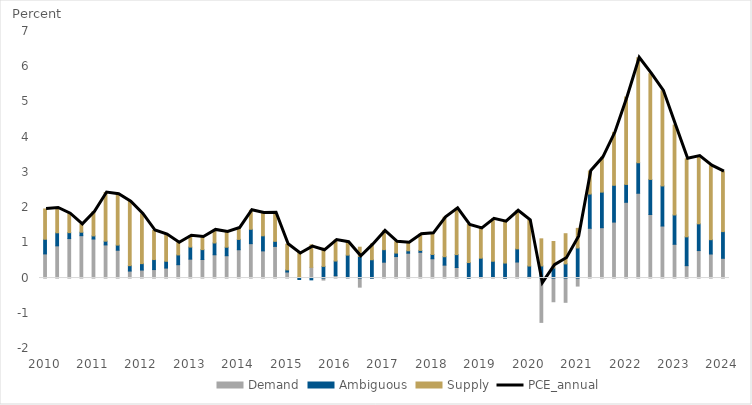
| Category | Demand | Ambiguous | Supply |
|---|---|---|---|
| 2010 | 0.686 | 0.416 | 0.86 |
| 2010 Q2 | 0.915 | 0.37 | 0.704 |
| 2010 Q3 | 1.121 | 0.168 | 0.538 |
| 2010 Q4 | 1.204 | 0.098 | 0.223 |
| 2011 | 1.108 | 0.088 | 0.685 |
| 2011 Q2 | 0.941 | 0.106 | 1.382 |
| 2011 Q3 | 0.79 | 0.145 | 1.446 |
| 2011 Q4 | 0.199 | 0.153 | 1.819 |
| 2012 | 0.228 | 0.182 | 1.413 |
| 2012 Q2 | 0.241 | 0.284 | 0.825 |
| 2012 Q3 | 0.284 | 0.193 | 0.758 |
| 2012 Q4 | 0.379 | 0.278 | 0.346 |
| 2013 | 0.536 | 0.343 | 0.323 |
| 2013 Q2 | 0.527 | 0.28 | 0.357 |
| 2013 Q3 | 0.661 | 0.335 | 0.37 |
| 2013 Q4 | 0.634 | 0.242 | 0.431 |
| 2014 | 0.804 | 0.293 | 0.327 |
| 2014 Q2 | 0.977 | 0.408 | 0.541 |
| 2014 Q3 | 0.772 | 0.427 | 0.651 |
| 2014 Q4 | 0.899 | 0.144 | 0.813 |
| 2015 | 0.172 | 0.059 | 0.729 |
| 2015 Q2 | 0.032 | -0.041 | 0.706 |
| 2015 Q3 | 0.304 | -0.051 | 0.638 |
| 2015 Q4 | -0.057 | 0.331 | 0.514 |
| 2016 | 0.069 | 0.415 | 0.597 |
| 2016 Q2 | 0.012 | 0.639 | 0.368 |
| 2016 Q3 | -0.258 | 0.615 | 0.261 |
| 2016 Q4 | -0.012 | 0.519 | 0.448 |
| 2017 | 0.451 | 0.355 | 0.533 |
| 2017 Q2 | 0.611 | 0.099 | 0.321 |
| 2017 Q3 | 0.706 | 0.069 | 0.229 |
| 2017 Q4 | 0.732 | 0.053 | 0.461 |
| 2018 | 0.548 | 0.122 | 0.599 |
| 2018 Q2 | 0.367 | 0.239 | 1.121 |
| 2018 Q3 | 0.3 | 0.366 | 1.314 |
| 2018 Q4 | -0.01 | 0.44 | 1.081 |
| 2019 | 0.019 | 0.546 | 0.846 |
| 2019 Q2 | 0.045 | 0.432 | 1.204 |
| 2019 Q3 | -0.008 | 0.426 | 1.183 |
| 2019 Q4 | 0.455 | 0.373 | 1.082 |
| 2020 | 0.047 | 0.294 | 1.299 |
| 2020 Q2 | -1.259 | 0.344 | 0.77 |
| 2020 Q3 | -0.673 | 0.286 | 0.752 |
| 2020 Q4 | -0.689 | 0.403 | 0.856 |
| 2021 | -0.227 | 0.855 | 0.556 |
| 2021 Q2 | 1.413 | 0.973 | 0.653 |
| 2021 Q3 | 1.43 | 1.01 | 0.987 |
| 2021 Q4 | 1.589 | 1.044 | 1.505 |
| 2022 | 2.151 | 0.507 | 2.484 |
| 2022 Q2 | 2.408 | 0.866 | 2.981 |
| 2022 Q3 | 1.804 | 0.996 | 3.002 |
| 2022 Q4 | 1.477 | 1.139 | 2.699 |
| 2023 | 0.959 | 0.833 | 2.553 |
| 2023 Q2 | 0.352 | 0.818 | 2.216 |
| 2023 Q3 | 0.78 | 0.759 | 1.923 |
| 2023 Q4 | 0.683 | 0.406 | 2.101 |
| 2024 | 0.561 | 0.757 | 1.706 |